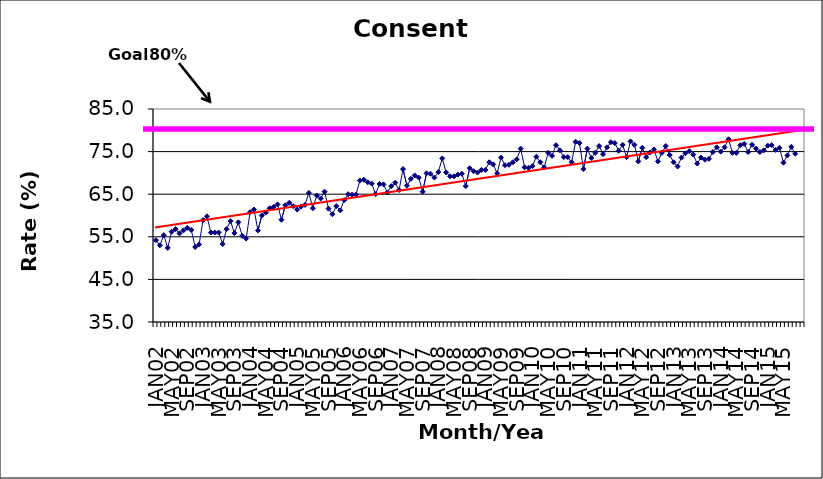
| Category | Series 0 |
|---|---|
| JAN02 | 54.2 |
| FEB02 | 53 |
| MAR02 | 55.4 |
| APR02 | 52.4 |
| MAY02 | 56.2 |
| JUN02 | 56.8 |
| JUL02 | 55.8 |
| AUG02 | 56.5 |
| SEP02 | 57.1 |
| OCT02 | 56.6 |
| NOV02 | 52.6 |
| DEC02 | 53.2 |
| JAN03 | 58.9 |
| FEB03 | 59.8 |
| MAR03 | 56 |
| APR03 | 56 |
| MAY03 | 56 |
| JUN03 | 53.3 |
| JUL03 | 56.8 |
| AUG03 | 58.7 |
| SEP03 | 55.9 |
| OCT03 | 58.4 |
| NOV03 | 55.2 |
| DEC03 | 54.6 |
| JAN04 | 60.8 |
| FEB04 | 61.4 |
| MAR04 | 56.5 |
| APR04 | 60 |
| MAY04 | 60.7 |
| JUN04 | 61.7 |
| JUL04 | 62 |
| AUG04 | 62.6 |
| SEP04 | 59 |
| OCT04 | 62.4 |
| NOV04 | 63 |
| DEC04 | 62.2 |
| JAN05 | 61.4 |
| FEB05 | 62.1 |
| MAR05 | 62.5 |
| APR05 | 65.3 |
| MAY05 | 61.7 |
| JUN05 | 64.7 |
| JUL05 | 64 |
| AUG05 | 65.6 |
| SEP05 | 61.6 |
| OCT05 | 60.3 |
| NOV05 | 62.2 |
| DEC05 | 61.2 |
| JAN06 | 63.6 |
| FEB06 | 65 |
| MAR06 | 64.9 |
| APR06 | 64.9 |
| MAY06 | 68.2 |
| JUN06 | 68.4 |
| JUL06 | 67.8 |
| AUG06 | 67.5 |
| SEP06 | 65 |
| OCT06 | 67.4 |
| NOV06 | 67.3 |
| DEC06 | 65.4 |
| JAN07 | 66.9 |
| FEB07 | 67.7 |
| MAR07 | 66 |
| APR07 | 70.9 |
| MAY07 | 67 |
| JUN07 | 68.6 |
| JUL07 | 69.4 |
| AUG07 | 68.9 |
| SEP07 | 65.6 |
| OCT07 | 69.9 |
| NOV07 | 69.8 |
| DEC07 | 68.9 |
| JAN08 | 70.2 |
| FEB08 | 73.4 |
| MAR08 | 70.1 |
| APR08 | 69.2 |
| MAY08 | 69.2 |
| JUN08 | 69.6 |
| JUL08 | 69.8 |
| AUG08 | 66.9 |
| SEP08 | 71.1 |
| OCT08 | 70.4 |
| NOV08 | 70.1 |
| DEC08 | 70.7 |
| JAN09 | 70.7 |
| FEB09 | 72.5 |
| MAR09 | 72 |
| APR09 | 69.9 |
| MAY09 | 73.6 |
| JUN09 | 71.8 |
| JUL09 | 71.9 |
| AUG09 | 72.5 |
| SEP09 | 73.2 |
| OCT09 | 75.7 |
| NOV09 | 71.3 |
| DEC09 | 71.2 |
| JAN10 | 71.6 |
| FEB10 | 73.8 |
| MAR10 | 72.5 |
| APR10 | 71.3 |
| MAY10 | 74.7 |
| JUN10 | 74 |
| JUL10 | 76.5 |
| AUG10 | 75.3 |
| SEP10 | 73.7 |
| OCT10 | 73.7 |
| NOV10 | 72.5 |
| DEC10 | 77.3 |
| JAN11 | 77 |
| FEB11 | 70.9 |
| MAR11 | 75.7 |
| APR11 | 73.5 |
| MAY11 | 74.7 |
| JUN11 | 76.3 |
| JUL11 | 74.4 |
| AUG11 | 76 |
| SEP11 | 77.2 |
| OCT11 | 77 |
| NOV11 | 75.2 |
| DEC11 | 76.6 |
| JAN12 | 73.7 |
| FEB12 | 77.4 |
| MAR12 | 76.6 |
| APR12 | 72.7 |
| MAY12 | 75.9 |
| JUN12 | 73.7 |
| JUL12 | 74.8 |
| AUG12 | 75.5 |
| SEP12 | 72.7 |
| OCT12 | 74.7 |
| NOV12 | 76.3 |
| DEC12 | 74.2 |
| JAN13 | 72.5 |
| FEB13 | 71.5 |
| MAR13 | 73.6 |
| APR13 | 74.6 |
| MAY13 | 75.1 |
| JUN13 | 74.3 |
| JUL13 | 72.2 |
| AUG13 | 73.6 |
| SEP13 | 73.1 |
| OCT13 | 73.3 |
| NOV13 | 74.9 |
| DEC13 | 76 |
| JAN14 | 75 |
| FEB14 | 76 |
| MAR14 | 77.9 |
| APR14 | 74.7 |
| MAY14 | 74.7 |
| JUN14 | 76.5 |
| JUL14 | 76.8 |
| AUG14 | 74.9 |
| SEP14 | 76.6 |
| OCT14 | 75.7 |
| NOV14 | 74.9 |
| DEC14 | 75.3 |
| JAN15 | 76.4 |
| FEB15 | 76.5 |
| MAR15 | 75.4 |
| APR15 | 75.9 |
| MAY15 | 72.4 |
| JUN15 | 74.1 |
| JUL15 | 76.1 |
| AUG15 | 74.5 |